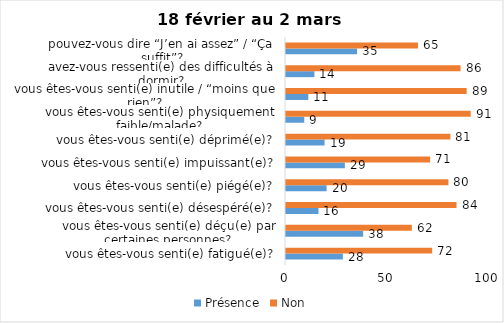
| Category | Présence | Non |
|---|---|---|
| vous êtes-vous senti(e) fatigué(e)? | 28 | 72 |
| vous êtes-vous senti(e) déçu(e) par certaines personnes? | 38 | 62 |
| vous êtes-vous senti(e) désespéré(e)? | 16 | 84 |
| vous êtes-vous senti(e) piégé(e)? | 20 | 80 |
| vous êtes-vous senti(e) impuissant(e)? | 29 | 71 |
| vous êtes-vous senti(e) déprimé(e)? | 19 | 81 |
| vous êtes-vous senti(e) physiquement faible/malade? | 9 | 91 |
| vous êtes-vous senti(e) inutile / “moins que rien”? | 11 | 89 |
| avez-vous ressenti(e) des difficultés à dormir? | 14 | 86 |
| pouvez-vous dire “J’en ai assez” / “Ça suffit”? | 35 | 65 |